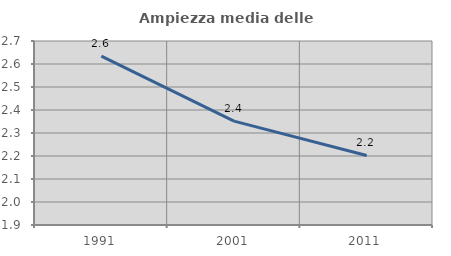
| Category | Ampiezza media delle famiglie |
|---|---|
| 1991.0 | 2.634 |
| 2001.0 | 2.352 |
| 2011.0 | 2.202 |